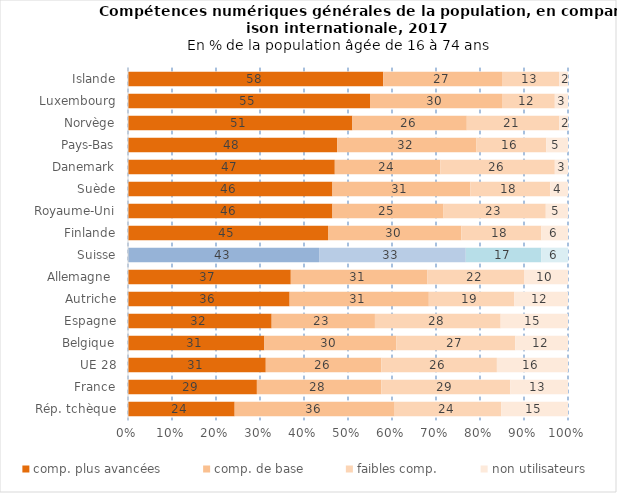
| Category | comp. plus avancées | comp. de base | faibles comp. | non utilisateurs |
|---|---|---|---|---|
| Rép. tchèque | 24 | 36 | 24 | 15 |
| France | 29 | 28 | 29 | 13 |
| UE 28 | 31 | 26 | 26 | 16 |
| Belgique | 31 | 30 | 27 | 12 |
| Espagne | 32 | 23 | 28 | 15 |
| Autriche | 36 | 31 | 19 | 12 |
| Allemagne  | 37 | 31 | 22 | 10 |
| Suisse | 43 | 33 | 17 | 6 |
| Finlande | 45 | 30 | 18 | 6 |
| Royaume-Uni | 46 | 25 | 23 | 5 |
| Suède | 46 | 31 | 18 | 4 |
| Danemark | 47 | 24 | 26 | 3 |
| Pays-Bas | 48 | 32 | 16 | 5 |
| Norvège | 51 | 26 | 21 | 2 |
| Luxembourg | 55 | 30 | 12 | 3 |
| Islande | 58 | 27 | 13 | 2 |